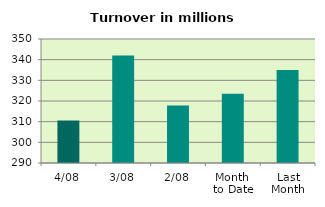
| Category | Series 0 |
|---|---|
| 4/08 | 310.597 |
| 3/08 | 342.044 |
| 2/08 | 317.822 |
| Month 
to Date | 323.488 |
| Last
Month | 334.97 |